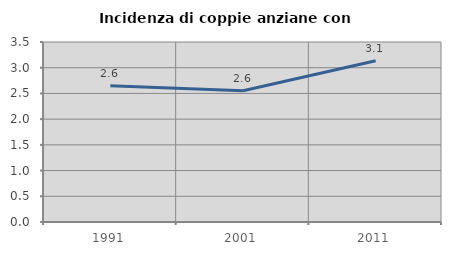
| Category | Incidenza di coppie anziane con figli |
|---|---|
| 1991.0 | 2.648 |
| 2001.0 | 2.551 |
| 2011.0 | 3.136 |